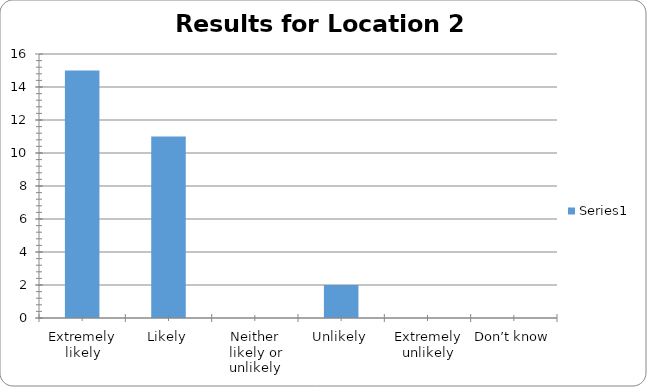
| Category | Series 0 |
|---|---|
| Extremely likely | 15 |
| Likely | 11 |
| Neither likely or unlikely | 0 |
| Unlikely | 2 |
| Extremely unlikely | 0 |
| Don’t know | 0 |